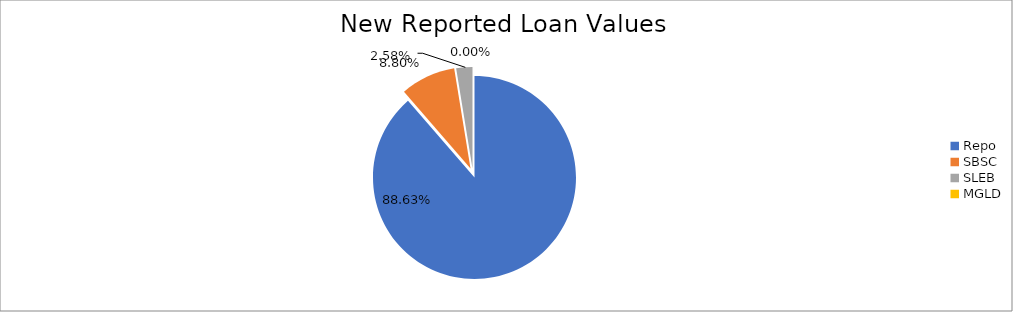
| Category | Series 0 |
|---|---|
| Repo | 9821480.811 |
| SBSC | 974799.074 |
| SLEB | 285398.799 |
| MGLD | 135.661 |